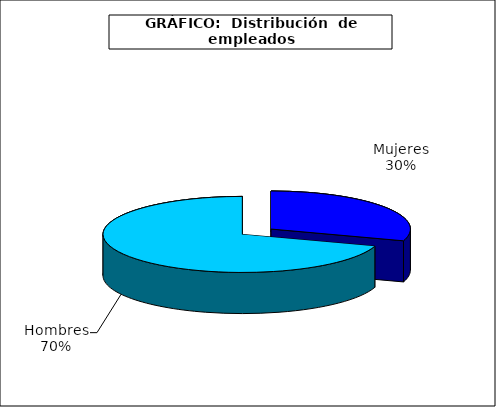
| Category | persona |
|---|---|
| 0 | 3076.951 |
| 1 | 7176.501 |